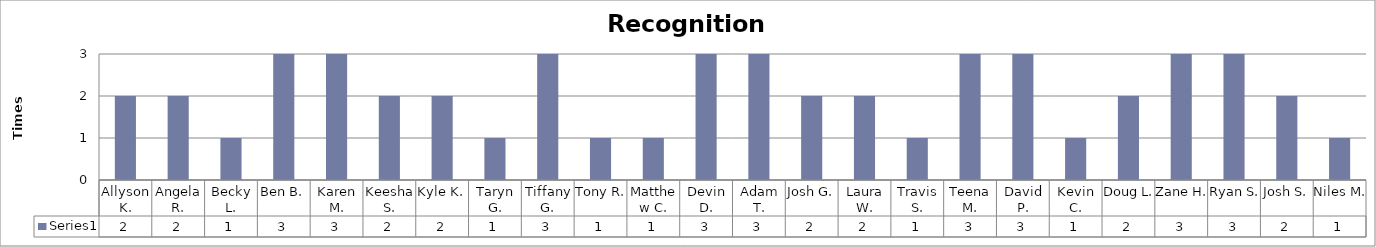
| Category | Series 0 |
|---|---|
| Allyson K. | 2 |
| Angela R. | 2 |
| Becky L. | 1 |
| Ben B. | 3 |
| Karen M. | 3 |
| Keesha S. | 2 |
| Kyle K. | 2 |
| Taryn G. | 1 |
| Tiffany G. | 3 |
| Tony R. | 1 |
| Matthew C. | 1 |
| Devin D. | 3 |
| Adam T. | 3 |
| Josh G. | 2 |
| Laura W. | 2 |
| Travis S. | 1 |
| Teena M. | 3 |
| David P. | 3 |
| Kevin C. | 1 |
| Doug L. | 2 |
| Zane H. | 3 |
| Ryan S. | 3 |
| Josh S. | 2 |
| Niles M. | 1 |